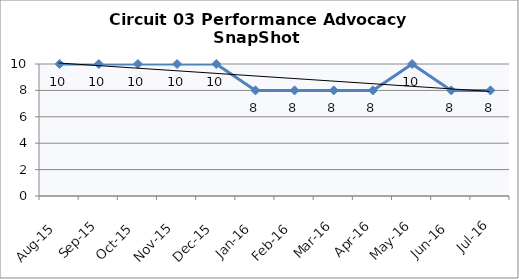
| Category | Circuit 03 |
|---|---|
| Aug-15 | 10 |
| Sep-15 | 10 |
| Oct-15 | 10 |
| Nov-15 | 10 |
| Dec-15 | 10 |
| Jan-16 | 8 |
| Feb-16 | 8 |
| Mar-16 | 8 |
| Apr-16 | 8 |
| May-16 | 10 |
| Jun-16 | 8 |
| Jul-16 | 8 |